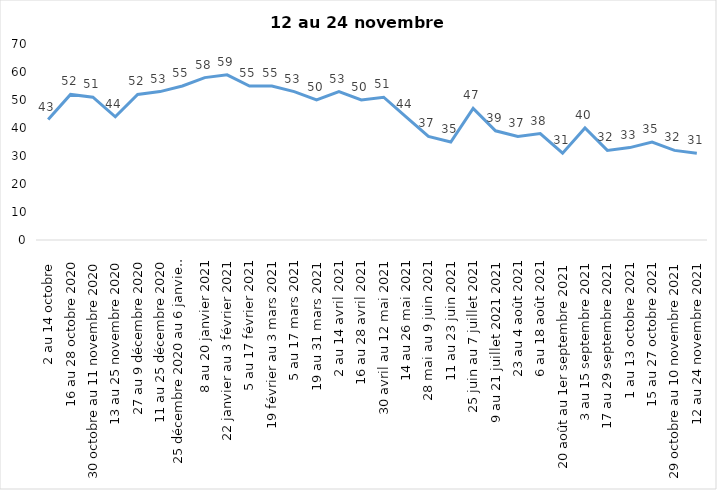
| Category | Toujours aux trois mesures |
|---|---|
| 2 au 14 octobre  | 43 |
| 16 au 28 octobre 2020 | 52 |
| 30 octobre au 11 novembre 2020 | 51 |
| 13 au 25 novembre 2020 | 44 |
| 27 au 9 décembre 2020 | 52 |
| 11 au 25 décembre 2020 | 53 |
| 25 décembre 2020 au 6 janvier 2021 | 55 |
| 8 au 20 janvier 2021 | 58 |
| 22 janvier au 3 février 2021 | 59 |
| 5 au 17 février 2021 | 55 |
| 19 février au 3 mars 2021 | 55 |
| 5 au 17 mars 2021 | 53 |
| 19 au 31 mars 2021 | 50 |
| 2 au 14 avril 2021 | 53 |
| 16 au 28 avril 2021 | 50 |
| 30 avril au 12 mai 2021 | 51 |
| 14 au 26 mai 2021 | 44 |
| 28 mai au 9 juin 2021 | 37 |
| 11 au 23 juin 2021 | 35 |
| 25 juin au 7 juillet 2021 | 47 |
| 9 au 21 juillet 2021 2021 | 39 |
| 23 au 4 août 2021 | 37 |
| 6 au 18 août 2021 | 38 |
| 20 août au 1er septembre 2021 | 31 |
| 3 au 15 septembre 2021 | 40 |
| 17 au 29 septembre 2021 | 32 |
| 1 au 13 octobre 2021 | 33 |
| 15 au 27 octobre 2021 | 35 |
| 29 octobre au 10 novembre 2021 | 32 |
| 12 au 24 novembre 2021 | 31 |